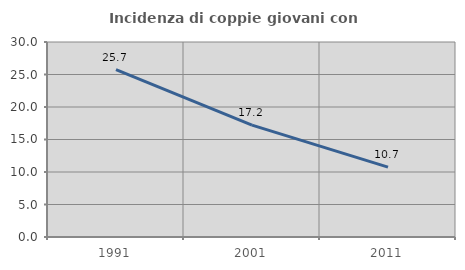
| Category | Incidenza di coppie giovani con figli |
|---|---|
| 1991.0 | 25.735 |
| 2001.0 | 17.209 |
| 2011.0 | 10.745 |